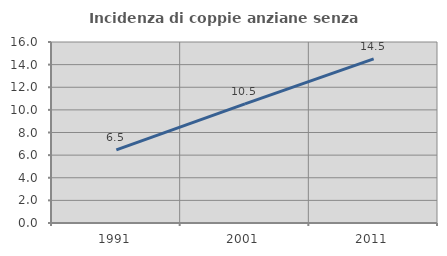
| Category | Incidenza di coppie anziane senza figli  |
|---|---|
| 1991.0 | 6.464 |
| 2001.0 | 10.536 |
| 2011.0 | 14.508 |